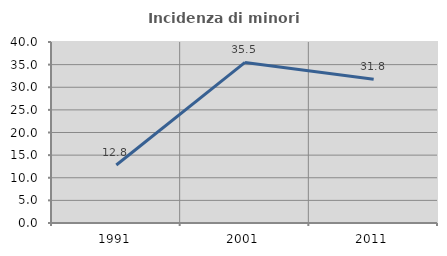
| Category | Incidenza di minori stranieri |
|---|---|
| 1991.0 | 12.821 |
| 2001.0 | 35.484 |
| 2011.0 | 31.754 |